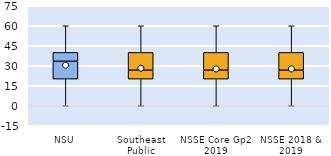
| Category | 25th | 50th | 75th |
|---|---|---|---|
| NSU | 20 | 13.333 | 6.667 |
| Southeast Public | 20 | 6.667 | 13.333 |
| NSSE Core Gp2 2019 | 20 | 6.667 | 13.333 |
| NSSE 2018 & 2019 | 20 | 6.667 | 13.333 |